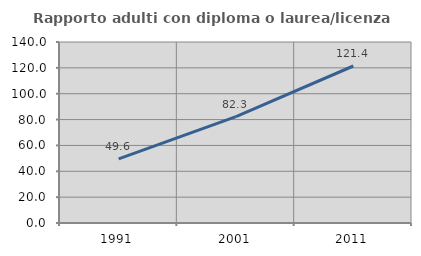
| Category | Rapporto adulti con diploma o laurea/licenza media  |
|---|---|
| 1991.0 | 49.574 |
| 2001.0 | 82.298 |
| 2011.0 | 121.436 |